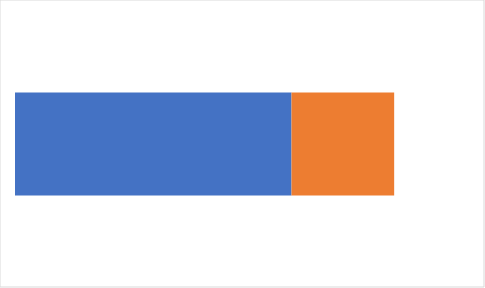
| Category | Так | Ні  |
|---|---|---|
| 0 | 0.729 | 0.271 |